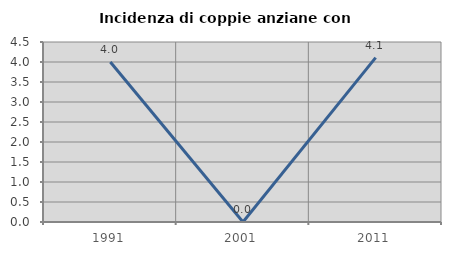
| Category | Incidenza di coppie anziane con figli |
|---|---|
| 1991.0 | 4 |
| 2001.0 | 0 |
| 2011.0 | 4.11 |